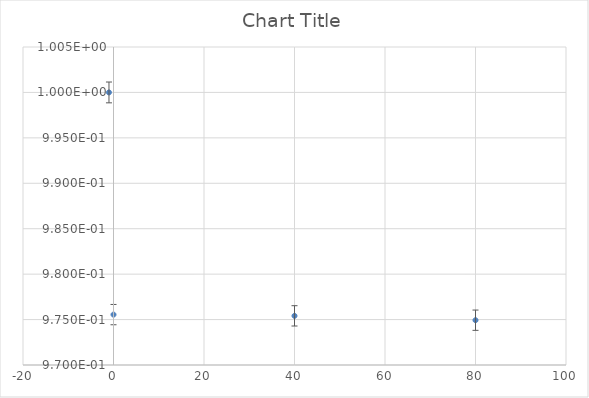
| Category | Series 0 |
|---|---|
| 0.0 | 0.976 |
| 40.0 | 0.975 |
| 80.0 | 0.975 |
| -1.0 | 1 |